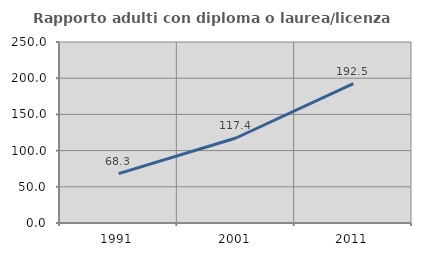
| Category | Rapporto adulti con diploma o laurea/licenza media  |
|---|---|
| 1991.0 | 68.286 |
| 2001.0 | 117.388 |
| 2011.0 | 192.486 |